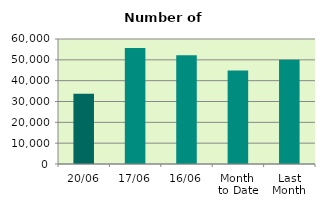
| Category | Series 0 |
|---|---|
| 20/06 | 33720 |
| 17/06 | 55658 |
| 16/06 | 52238 |
| Month 
to Date | 44876.714 |
| Last
Month | 50099.545 |